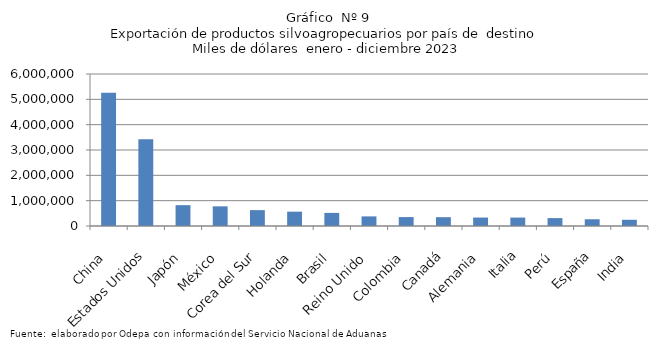
| Category | Series 0 |
|---|---|
| China | 5263797.668 |
| Estados Unidos | 3422790.971 |
| Japón | 822608.917 |
| México | 775901.616 |
| Corea del Sur | 627062.116 |
| Holanda | 565759.346 |
| Brasil | 517341.323 |
| Reino Unido | 379114.209 |
| Colombia | 351829.808 |
| Canadá | 348238.075 |
| Alemania | 333367.394 |
| Italia | 331973.764 |
| Perú | 311890.186 |
| España | 266320.362 |
| India | 245415.006 |